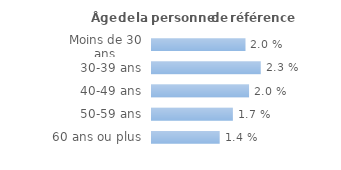
| Category | Series 0 |
|---|---|
| Moins de 30 ans | 0.02 |
| 30-39 ans | 0.023 |
| 40-49 ans | 0.02 |
| 50-59 ans | 0.017 |
| 60 ans ou plus | 0.014 |